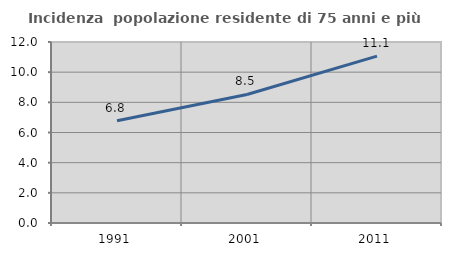
| Category | Incidenza  popolazione residente di 75 anni e più |
|---|---|
| 1991.0 | 6.774 |
| 2001.0 | 8.521 |
| 2011.0 | 11.065 |